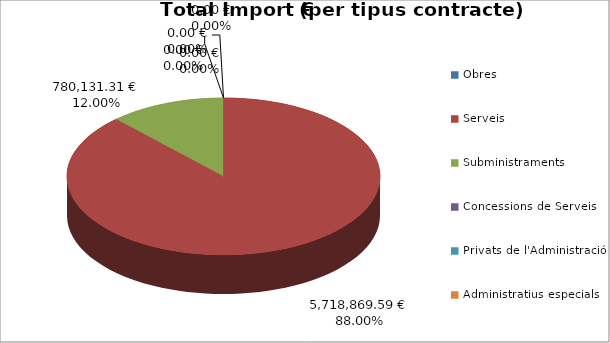
| Category | Total preu              (amb iva) |
|---|---|
| Obres | 0 |
| Serveis | 5718869.59 |
| Subministraments | 780131.315 |
| Concessions de Serveis | 0 |
| Privats de l'Administració | 0 |
| Administratius especials | 0 |